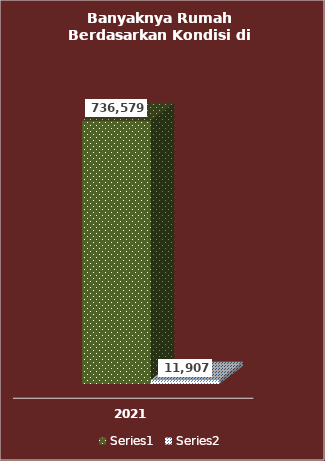
| Category | Series 0 | Series 1 |
|---|---|---|
| 2021.0 | 736579 | 11907 |